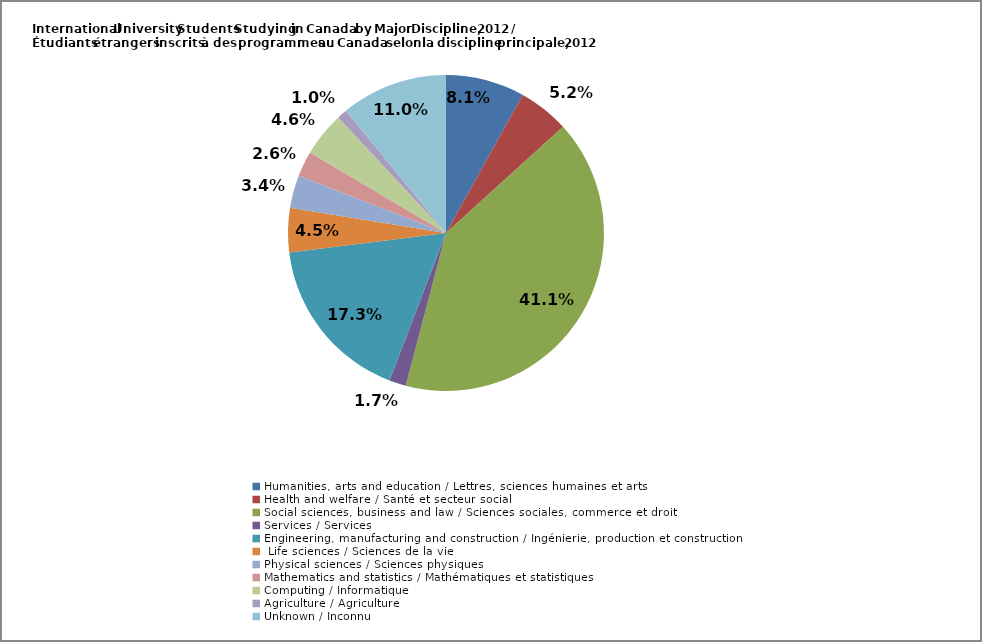
| Category | Series 0 |
|---|---|
| Humanities, arts and education / Lettres, sciences humaines et arts | 0.081 |
| Health and welfare / Santé et secteur social | 0.052 |
| Social sciences, business and law / Sciences sociales, commerce et droit | 0.411 |
| Services / Services | 0.017 |
| Engineering, manufacturing and construction / Ingénierie, production et construction | 0.173 |
|  Life sciences / Sciences de la vie | 0.045 |
| Physical sciences / Sciences physiques | 0.034 |
| Mathematics and statistics / Mathématiques et statistiques | 0.026 |
| Computing / Informatique | 0.046 |
| Agriculture / Agriculture | 0.01 |
| Unknown / Inconnu | 0.11 |